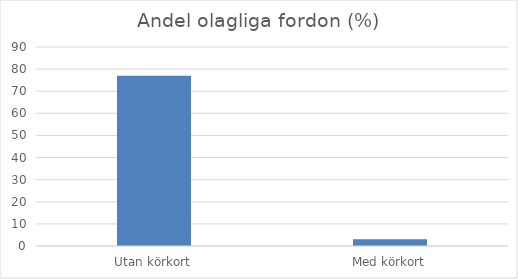
| Category | Andel % |
|---|---|
| Utan körkort | 77 |
| Med körkort | 3 |